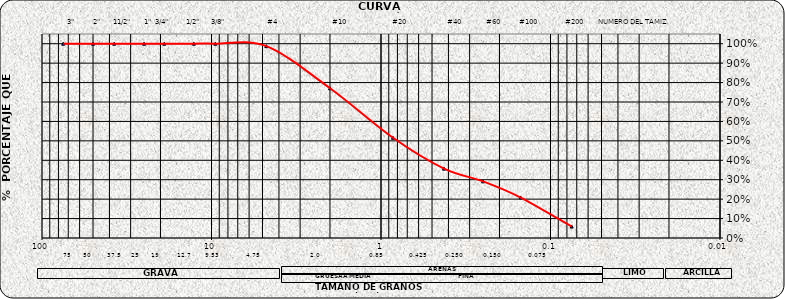
| Category | Series 0 |
|---|---|
| 75.0 | 1 |
| 50.0 | 1 |
| 37.5 | 1 |
| 25.0 | 1 |
| 19.0 | 1 |
| 12.7 | 1 |
| 9.5 | 1 |
| 4.75 | 0.988 |
| 2.0 | 0.771 |
| 0.85 | 0.516 |
| 0.425 | 0.357 |
| 0.25 | 0.292 |
| 0.15 | 0.208 |
| 0.075 | 0.059 |
| nan | 0 |